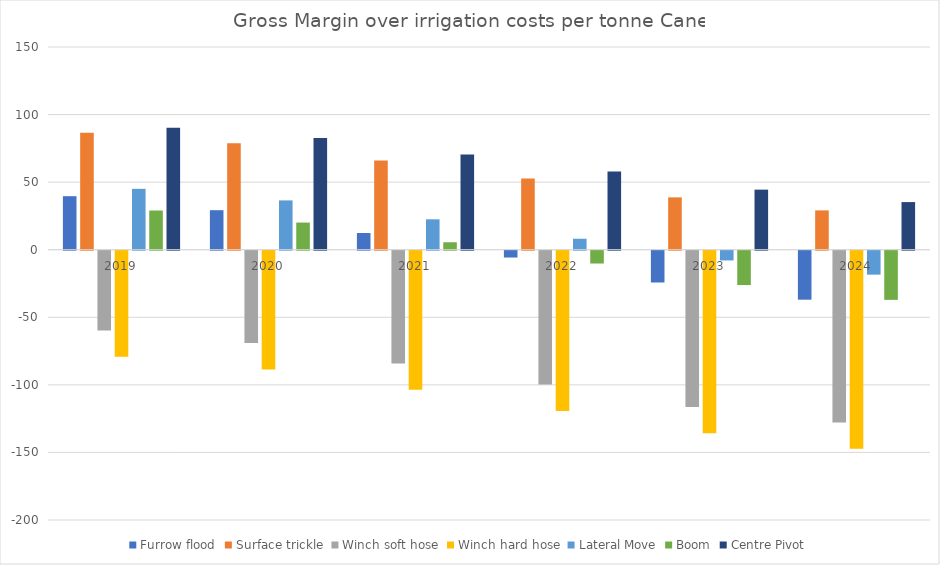
| Category | Furrow flood | Surface trickle | Winch soft hose | Winch hard hose | Lateral Move | Boom | Centre Pivot |
|---|---|---|---|---|---|---|---|
| 2019.0 | 39.605 | 86.631 | -59.027 | -78.527 | 45.052 | 29.013 | 90.17 |
| 2020.0 | 29.251 | 78.777 | -68.309 | -87.809 | 36.484 | 20.087 | 82.673 |
| 2021.0 | 12.351 | 65.956 | -83.461 | -102.961 | 22.497 | 5.518 | 70.435 |
| 2022.0 | -5.033 | 52.768 | -99.046 | -118.546 | 8.111 | -9.468 | 57.847 |
| 2023.0 | -23.523 | 38.741 | -115.624 | -135.124 | -7.191 | -25.407 | 44.458 |
| 2024.0 | -36.238 | 29.096 | -127.023 | -146.523 | -17.714 | -36.369 | 35.25 |